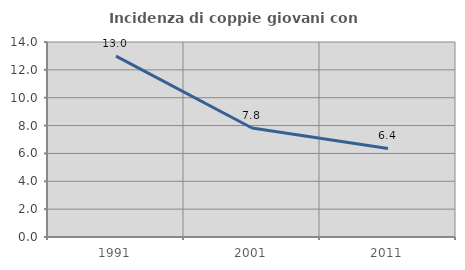
| Category | Incidenza di coppie giovani con figli |
|---|---|
| 1991.0 | 12.982 |
| 2001.0 | 7.823 |
| 2011.0 | 6.355 |